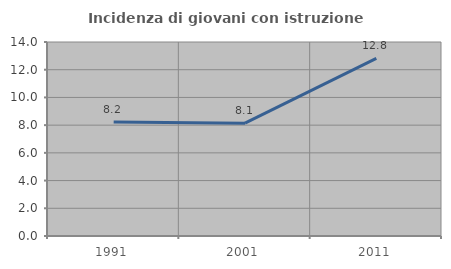
| Category | Incidenza di giovani con istruzione universitaria |
|---|---|
| 1991.0 | 8.219 |
| 2001.0 | 8.14 |
| 2011.0 | 12.821 |